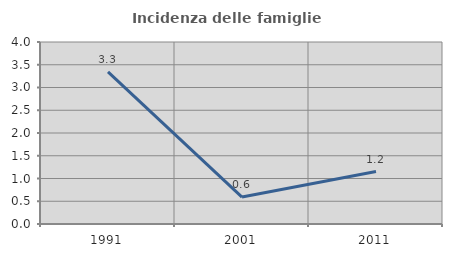
| Category | Incidenza delle famiglie numerose |
|---|---|
| 1991.0 | 3.343 |
| 2001.0 | 0.592 |
| 2011.0 | 1.153 |